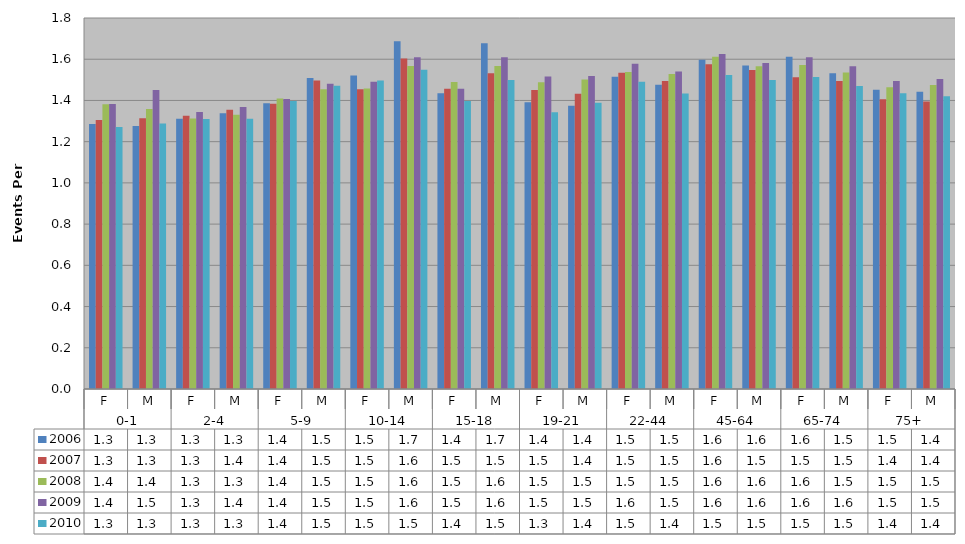
| Category | 2006 | 2007 | 2008 | 2009 | 2010 |
|---|---|---|---|---|---|
| 0 | 1.286 | 1.305 | 1.382 | 1.383 | 1.271 |
| 1 | 1.276 | 1.313 | 1.359 | 1.451 | 1.288 |
| 2 | 1.311 | 1.325 | 1.313 | 1.344 | 1.31 |
| 3 | 1.338 | 1.354 | 1.33 | 1.369 | 1.311 |
| 4 | 1.387 | 1.384 | 1.41 | 1.407 | 1.397 |
| 5 | 1.509 | 1.497 | 1.454 | 1.481 | 1.471 |
| 6 | 1.521 | 1.454 | 1.458 | 1.49 | 1.497 |
| 7 | 1.687 | 1.603 | 1.567 | 1.61 | 1.549 |
| 8 | 1.435 | 1.456 | 1.489 | 1.456 | 1.397 |
| 9 | 1.677 | 1.532 | 1.568 | 1.61 | 1.499 |
| 10 | 1.391 | 1.45 | 1.489 | 1.517 | 1.343 |
| 11 | 1.375 | 1.432 | 1.502 | 1.518 | 1.389 |
| 12 | 1.515 | 1.534 | 1.538 | 1.578 | 1.491 |
| 13 | 1.476 | 1.494 | 1.528 | 1.54 | 1.434 |
| 14 | 1.598 | 1.576 | 1.612 | 1.625 | 1.523 |
| 15 | 1.57 | 1.548 | 1.566 | 1.582 | 1.499 |
| 16 | 1.611 | 1.513 | 1.572 | 1.61 | 1.514 |
| 17 | 1.532 | 1.494 | 1.535 | 1.566 | 1.47 |
| 18 | 1.452 | 1.406 | 1.464 | 1.494 | 1.435 |
| 19 | 1.443 | 1.395 | 1.475 | 1.505 | 1.42 |